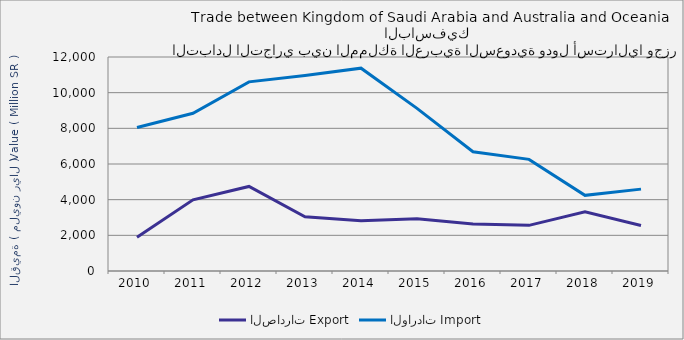
| Category | الصادرات | الواردات |
|---|---|---|
| 2010.0 | 1889668285 | 8048279335 |
| 2011.0 | 3992682331 | 8843697237 |
| 2012.0 | 4741151889 | 10607402622 |
| 2013.0 | 3042564981 | 10963237325 |
| 2014.0 | 2811960625 | 11374150151 |
| 2015.0 | 2934836125 | 9119675680 |
| 2016.0 | 2636107734 | 6688587788 |
| 2017.0 | 2559429233 | 6258835768 |
| 2018.0 | 3320780721 | 4243252018 |
| 2019.0 | 2555435428 | 4591473321 |